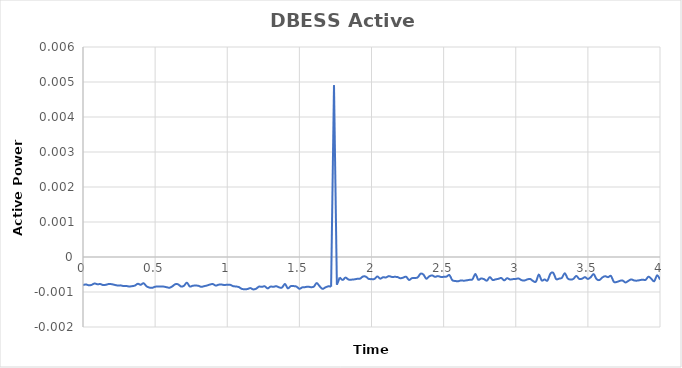
| Category | DBESS Active Power |
|---|---|
| 0.0 | -0.001 |
| 0.02 | -0.001 |
| 0.04 | -0.001 |
| 0.06 | -0.001 |
| 0.08 | -0.001 |
| 0.1 | -0.001 |
| 0.12 | -0.001 |
| 0.14 | -0.001 |
| 0.16 | -0.001 |
| 0.18 | -0.001 |
| 0.2 | -0.001 |
| 0.22 | -0.001 |
| 0.24 | -0.001 |
| 0.26 | -0.001 |
| 0.28 | -0.001 |
| 0.3 | -0.001 |
| 0.32 | -0.001 |
| 0.34 | -0.001 |
| 0.36 | -0.001 |
| 0.38 | -0.001 |
| 0.4 | -0.001 |
| 0.42 | -0.001 |
| 0.44 | -0.001 |
| 0.46 | -0.001 |
| 0.48 | -0.001 |
| 0.5 | -0.001 |
| 0.52 | -0.001 |
| 0.54 | -0.001 |
| 0.56 | -0.001 |
| 0.58 | -0.001 |
| 0.6 | -0.001 |
| 0.62 | -0.001 |
| 0.64 | -0.001 |
| 0.66 | -0.001 |
| 0.68 | -0.001 |
| 0.7 | -0.001 |
| 0.72 | -0.001 |
| 0.74 | -0.001 |
| 0.76 | -0.001 |
| 0.78 | -0.001 |
| 0.8 | -0.001 |
| 0.82 | -0.001 |
| 0.84 | -0.001 |
| 0.86 | -0.001 |
| 0.88 | -0.001 |
| 0.9 | -0.001 |
| 0.92 | -0.001 |
| 0.94 | -0.001 |
| 0.96 | -0.001 |
| 0.98 | -0.001 |
| 1.0 | -0.001 |
| 1.02 | -0.001 |
| 1.04 | -0.001 |
| 1.06 | -0.001 |
| 1.08 | -0.001 |
| 1.1 | -0.001 |
| 1.12 | -0.001 |
| 1.14 | -0.001 |
| 1.16 | -0.001 |
| 1.18 | -0.001 |
| 1.2 | -0.001 |
| 1.22 | -0.001 |
| 1.24 | -0.001 |
| 1.26 | -0.001 |
| 1.28 | -0.001 |
| 1.3 | -0.001 |
| 1.32 | -0.001 |
| 1.34 | -0.001 |
| 1.36 | -0.001 |
| 1.38 | -0.001 |
| 1.4 | -0.001 |
| 1.42 | -0.001 |
| 1.44 | -0.001 |
| 1.46 | -0.001 |
| 1.48 | -0.001 |
| 1.5 | -0.001 |
| 1.52 | -0.001 |
| 1.54 | -0.001 |
| 1.56 | -0.001 |
| 1.58 | -0.001 |
| 1.6 | -0.001 |
| 1.62 | -0.001 |
| 1.64 | -0.001 |
| 1.66 | -0.001 |
| 1.68 | -0.001 |
| 1.7 | -0.001 |
| 1.72 | -0.001 |
| 1.74 | 0.005 |
| 1.76 | -0.001 |
| 1.78 | -0.001 |
| 1.8 | -0.001 |
| 1.82 | -0.001 |
| 1.84 | -0.001 |
| 1.86 | -0.001 |
| 1.88 | -0.001 |
| 1.9 | -0.001 |
| 1.92 | -0.001 |
| 1.94 | -0.001 |
| 1.96 | -0.001 |
| 1.98 | -0.001 |
| 2.0 | -0.001 |
| 2.02 | -0.001 |
| 2.04 | -0.001 |
| 2.06 | -0.001 |
| 2.08 | -0.001 |
| 2.1 | -0.001 |
| 2.12 | -0.001 |
| 2.14 | -0.001 |
| 2.16 | -0.001 |
| 2.18 | -0.001 |
| 2.2 | -0.001 |
| 2.22 | -0.001 |
| 2.24 | -0.001 |
| 2.26 | -0.001 |
| 2.28 | -0.001 |
| 2.3 | -0.001 |
| 2.32 | -0.001 |
| 2.34 | 0 |
| 2.36 | -0.001 |
| 2.38 | -0.001 |
| 2.4 | -0.001 |
| 2.42 | -0.001 |
| 2.44 | -0.001 |
| 2.46 | -0.001 |
| 2.48 | -0.001 |
| 2.5 | -0.001 |
| 2.52 | -0.001 |
| 2.54 | -0.001 |
| 2.56 | -0.001 |
| 2.58 | -0.001 |
| 2.6 | -0.001 |
| 2.62 | -0.001 |
| 2.64 | -0.001 |
| 2.66 | -0.001 |
| 2.68 | -0.001 |
| 2.7 | -0.001 |
| 2.72 | 0 |
| 2.74 | -0.001 |
| 2.76 | -0.001 |
| 2.78 | -0.001 |
| 2.8 | -0.001 |
| 2.82 | -0.001 |
| 2.84 | -0.001 |
| 2.86 | -0.001 |
| 2.88 | -0.001 |
| 2.9 | -0.001 |
| 2.92 | -0.001 |
| 2.94 | -0.001 |
| 2.96 | -0.001 |
| 2.98 | -0.001 |
| 3.0 | -0.001 |
| 3.02 | -0.001 |
| 3.04 | -0.001 |
| 3.06 | -0.001 |
| 3.08 | -0.001 |
| 3.1 | -0.001 |
| 3.12 | -0.001 |
| 3.14 | -0.001 |
| 3.16 | -0.001 |
| 3.18 | -0.001 |
| 3.2 | -0.001 |
| 3.22 | -0.001 |
| 3.24 | 0 |
| 3.26 | 0 |
| 3.28 | -0.001 |
| 3.3 | -0.001 |
| 3.32 | -0.001 |
| 3.34 | 0 |
| 3.36 | -0.001 |
| 3.38 | -0.001 |
| 3.4 | -0.001 |
| 3.42 | -0.001 |
| 3.44 | -0.001 |
| 3.46 | -0.001 |
| 3.48 | -0.001 |
| 3.5 | -0.001 |
| 3.52 | -0.001 |
| 3.54 | 0 |
| 3.56 | -0.001 |
| 3.58 | -0.001 |
| 3.6 | -0.001 |
| 3.62 | -0.001 |
| 3.64 | -0.001 |
| 3.66 | -0.001 |
| 3.68 | -0.001 |
| 3.7 | -0.001 |
| 3.72 | -0.001 |
| 3.74 | -0.001 |
| 3.76 | -0.001 |
| 3.78 | -0.001 |
| 3.8 | -0.001 |
| 3.82 | -0.001 |
| 3.84 | -0.001 |
| 3.86 | -0.001 |
| 3.88 | -0.001 |
| 3.9 | -0.001 |
| 3.92 | -0.001 |
| 3.94 | -0.001 |
| 3.96 | -0.001 |
| 3.98 | -0.001 |
| 4.0 | -0.001 |